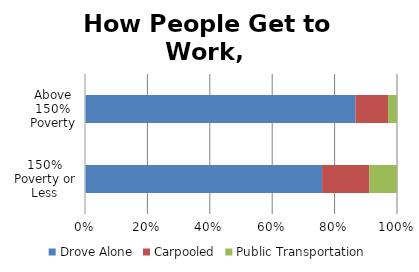
| Category | Drove Alone | Carpooled | Public Transportation |
|---|---|---|---|
| 150% Poverty or Less | 0.668 | 0.133 | 0.078 |
| Above 150% Poverty | 0.759 | 0.091 | 0.025 |